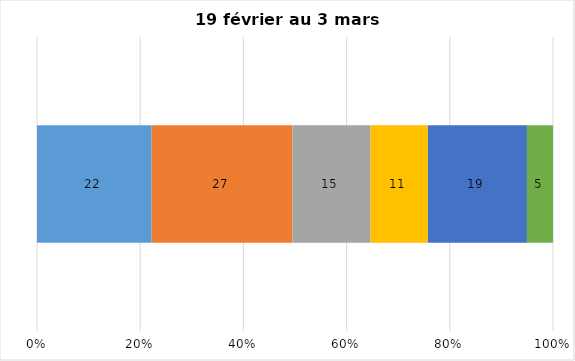
| Category | Plusieurs fois par jour | Une fois par jour | Quelques fois par semaine   | Une fois par semaine ou moins   |  Jamais   |  Je n’utilise pas les médias sociaux |
|---|---|---|---|---|---|---|
| 0 | 22 | 27 | 15 | 11 | 19 | 5 |